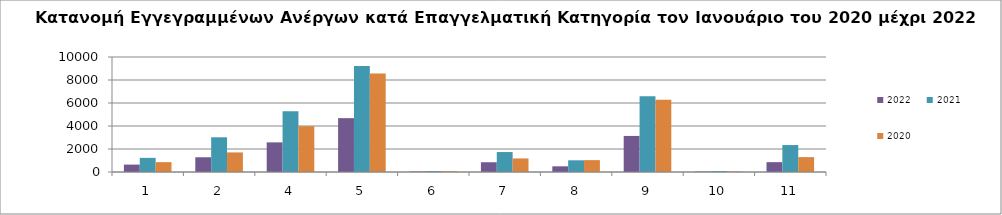
| Category | 2022 | 2021 | 2020 |
|---|---|---|---|
| 1.0 | 643 | 1229 | 857 |
| 2.0 | 1282 | 3018 | 1702 |
| 4.0 | 2576 | 5289 | 3980 |
| 5.0 | 4683 | 9212 | 8556 |
| 6.0 | 39 | 83 | 61 |
| 7.0 | 848 | 1736 | 1179 |
| 8.0 | 495 | 1017 | 1033 |
| 9.0 | 3136 | 6590 | 6279 |
| 10.0 | 38 | 81 | 46 |
| 11.0 | 856 | 2343 | 1294 |